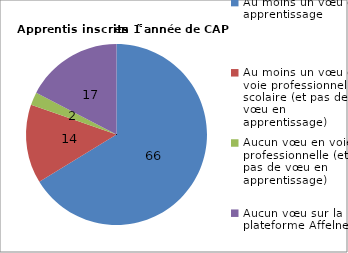
| Category | CAP |
|---|---|
| Au moins un vœu en apprentissage | 66.248 |
| Au moins un vœu en voie professionnelle scolaire (et pas de vœu en apprentissage) | 14.09 |
| Aucun vœu en voie professionnelle (et pas de vœu en apprentissage) | 2.301 |
| Aucun vœu sur la plateforme Affelnet | 17.361 |